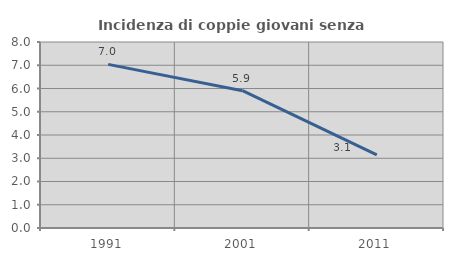
| Category | Incidenza di coppie giovani senza figli |
|---|---|
| 1991.0 | 7.037 |
| 2001.0 | 5.907 |
| 2011.0 | 3.146 |